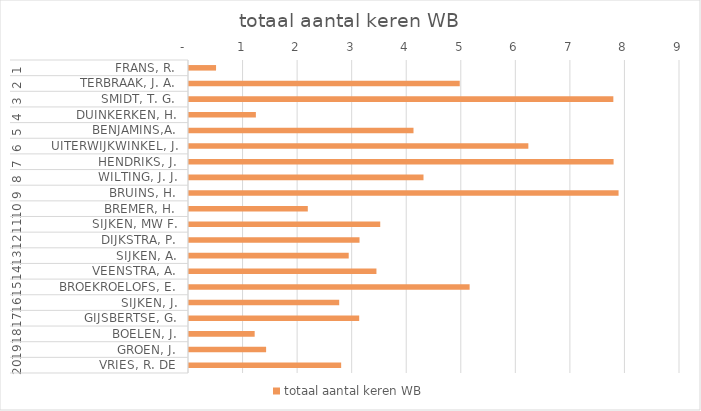
| Category | totaal aantal keren WB |
|---|---|
| 0 | 0.496 |
| 1 | 4.963 |
| 2 | 7.778 |
| 3 | 1.226 |
| 4 | 4.115 |
| 5 | 6.22 |
| 6 | 7.783 |
| 7 | 4.298 |
| 8 | 7.874 |
| 9 | 2.178 |
| 10 | 3.505 |
| 11 | 3.126 |
| 12 | 2.928 |
| 13 | 3.436 |
| 14 | 5.144 |
| 15 | 2.753 |
| 16 | 3.12 |
| 17 | 1.204 |
| 18 | 1.413 |
| 19 | 2.789 |